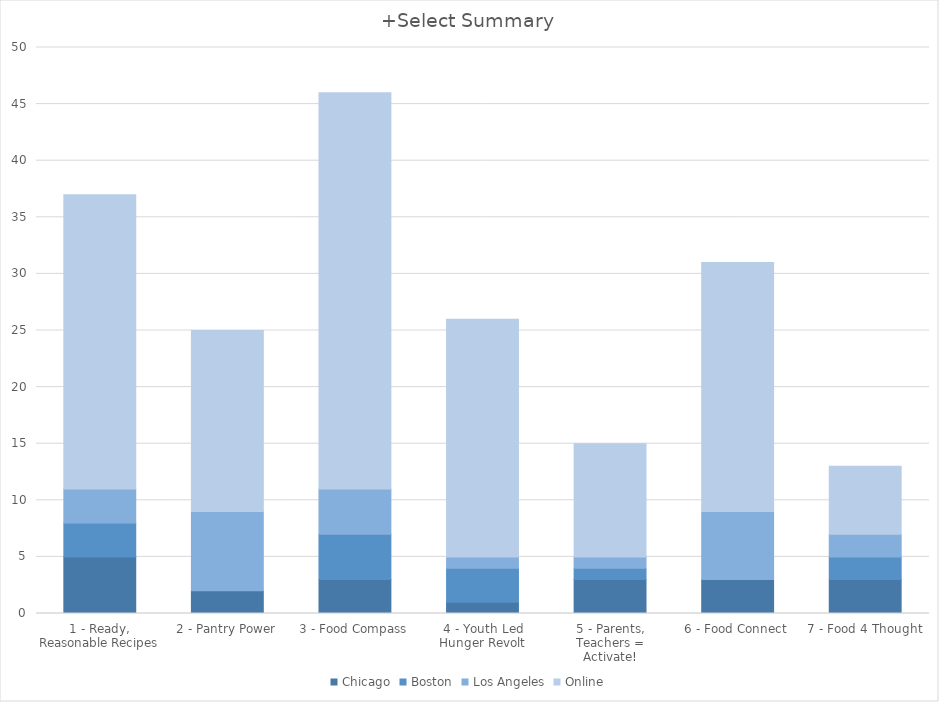
| Category | Chicago | Boston | Los Angeles | Online |
|---|---|---|---|---|
| 1 - Ready, Reasonable Recipes | 5 | 3 | 3 | 26 |
| 2 - Pantry Power | 2 | 0 | 7 | 16 |
| 3 - Food Compass | 3 | 4 | 4 | 35 |
| 4 - Youth Led Hunger Revolt | 1 | 3 | 1 | 21 |
| 5 - Parents, Teachers = Activate! | 3 | 1 | 1 | 10 |
| 6 - Food Connect | 3 | 0 | 6 | 22 |
| 7 - Food 4 Thought | 3 | 2 | 2 | 6 |